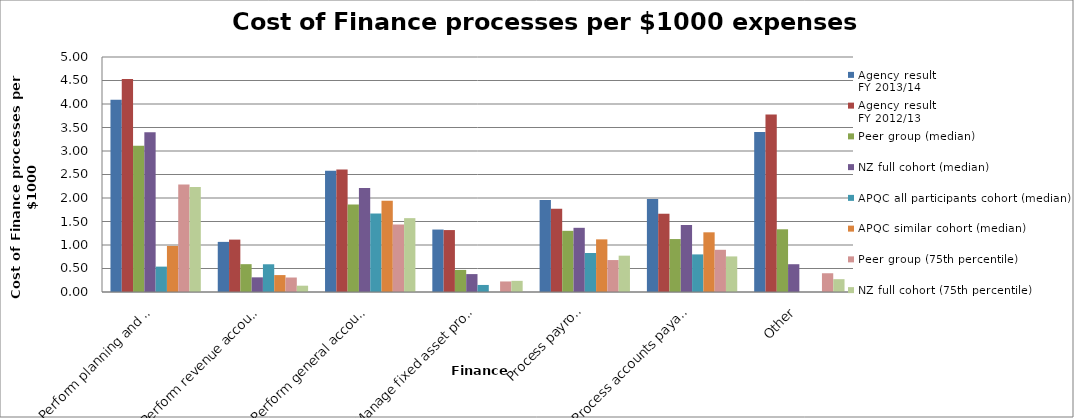
| Category | Agency result
FY 2013/14 | Agency result
FY 2012/13 | Peer group (median) | NZ full cohort (median) | APQC all participants cohort (median) | APQC similar cohort (median) | Peer group (75th percentile) | NZ full cohort (75th percentile) |
|---|---|---|---|---|---|---|---|---|
| Perform planning and management accounting | 4.09 | 4.531 | 3.11 | 3.4 | 0.54 | 0.98 | 2.288 | 2.236 |
| Perform revenue accounting | 1.066 | 1.115 | 0.592 | 0.312 | 0.59 | 0.36 | 0.308 | 0.134 |
| Perform general accounting and reporting | 2.581 | 2.604 | 1.861 | 2.215 | 1.67 | 1.94 | 1.436 | 1.571 |
| Manage fixed asset project accounting | 1.329 | 1.318 | 0.47 | 0.381 | 0.15 | 0 | 0.224 | 0.237 |
| Process payroll | 1.957 | 1.772 | 1.302 | 1.366 | 0.83 | 1.12 | 0.68 | 0.773 |
| Process accounts payable and expense reimbursements | 1.977 | 1.665 | 1.126 | 1.425 | 0.8 | 1.27 | 0.898 | 0.757 |
| Other | 3.405 | 3.774 | 1.334 | 0.591 | 0 | 0 | 0.399 | 0.273 |